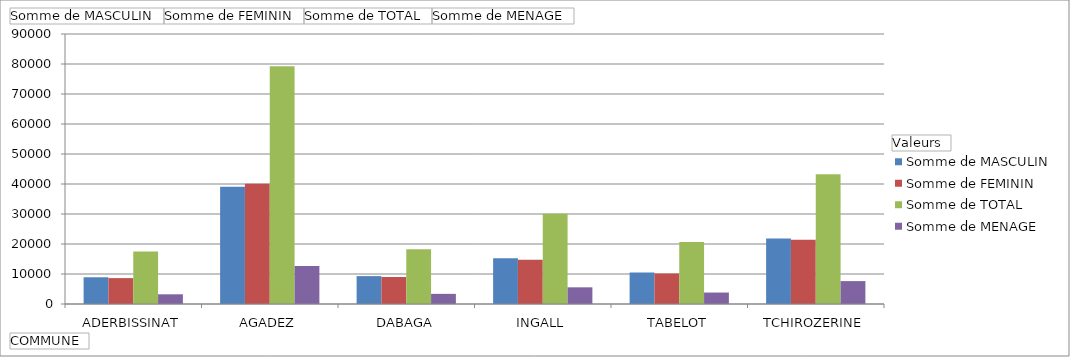
| Category | Somme de MASCULIN | Somme de FEMININ | Somme de TOTAL | Somme de MENAGE |
|---|---|---|---|---|
| ADERBISSINAT | 8910 | 8630 | 17540 | 3236 |
| AGADEZ | 39110 | 40118 | 79228 | 12672 |
| DABAGA | 9292 | 8994 | 18286 | 3380 |
| INGALL | 15278 | 14782 | 30060 | 5557 |
| TABELOT | 10499 | 10168 | 20667 | 3820 |
| TCHIROZERINE | 21869 | 21385 | 43254 | 7634 |